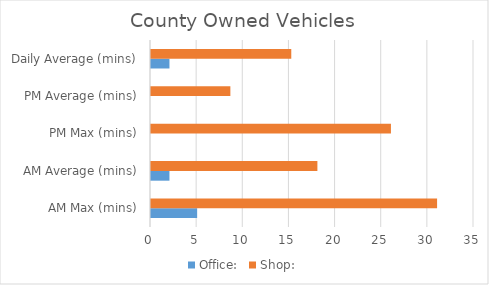
| Category | Office: | Shop: |
|---|---|---|
| AM Max (mins) | 5 | 31 |
| AM Average (mins) | 2 | 18.03 |
| PM Max (mins) | 0 | 26 |
| PM Average (mins) | 0 | 8.6 |
| Daily Average (mins) | 2 | 15.2 |